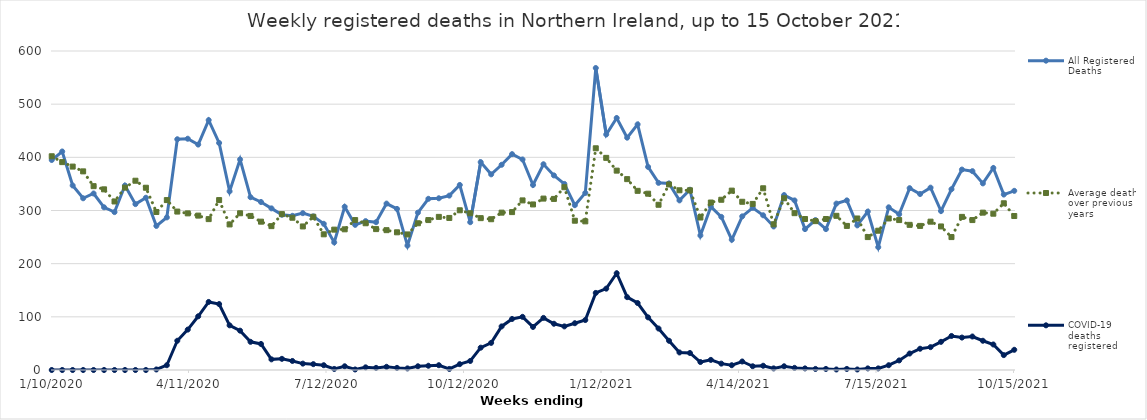
| Category | All Registered Deaths | Average deaths over previous 5 years | COVID-19 deaths registered |
|---|---|---|---|
| 1/10/20 | 395 | 402 | 0 |
| 1/17/20 | 411 | 391 | 0 |
| 1/24/20 | 347 | 382.6 | 0 |
| 1/31/20 | 323 | 373.6 | 0 |
| 2/7/20 | 332 | 345.8 | 0 |
| 2/14/20 | 306 | 339.8 | 0 |
| 2/21/20 | 297 | 317 | 0 |
| 2/28/20 | 347 | 343 | 0 |
| 3/6/20 | 312 | 356 | 0 |
| 3/13/20 | 324 | 342.8 | 0 |
| 3/20/20 | 271 | 297.2 | 1 |
| 3/27/20 | 287 | 319.6 | 9 |
| 4/3/20 | 434 | 298 | 55 |
| 4/10/20 | 435 | 294.6 | 76 |
| 4/17/20 | 424 | 290.4 | 101 |
| 4/24/20 | 470 | 283.8 | 128 |
| 5/1/20 | 427 | 319.6 | 124 |
| 5/8/20 | 336 | 273.8 | 84 |
| 5/15/20 | 396 | 294.8 | 74 |
| 5/22/20 | 325 | 289.8 | 53 |
| 5/29/20 | 316 | 279 | 49 |
| 6/5/20 | 304 | 270.6 | 20 |
| 6/12/20 | 292 | 293.2 | 21 |
| 6/19/20 | 290 | 286.4 | 17 |
| 6/26/20 | 295 | 270 | 12 |
| 7/3/20 | 289 | 288.2 | 11 |
| 7/10/20 | 275 | 255.2 | 9 |
| 7/17/20 | 240 | 264 | 2 |
| 7/24/20 | 307 | 264.6 | 7 |
| 7/31/20 | 273 | 282 | 1 |
| 8/7/20 | 280 | 276 | 5 |
| 8/14/20 | 278 | 265 | 4 |
| 8/21/20 | 313 | 263 | 6 |
| 8/28/20 | 303 | 259 | 4 |
| 9/4/20 | 234 | 255 | 3 |
| 9/11/20 | 296 | 276 | 7 |
| 9/18/20 | 322 | 282 | 8 |
| 9/25/20 | 323 | 288 | 9 |
| 10/2/20 | 328 | 286 | 2 |
| 10/9/20 | 348 | 300.4 | 11 |
| 10/16/20 | 278 | 294.8 | 17 |
| 10/23/20 | 391 | 285.6 | 42 |
| 10/30/20 | 368 | 283.6 | 51 |
| 11/6/20 | 386 | 296 | 82 |
| 11/13/20 | 406 | 297 | 96 |
| 11/20/20 | 396 | 319 | 100 |
| 11/27/20 | 348 | 311.4 | 81 |
| 12/4/20 | 387 | 322.4 | 98 |
| 12/11/20 | 366 | 321.8 | 87 |
| 12/18/20 | 350 | 343.8 | 82 |
| 12/25/20 | 310 | 280.8 | 88 |
| 1/1/21 | 333 | 279.6 | 94 |
| 1/8/21 | 568 | 417 | 145 |
| 1/15/21 | 443 | 399 | 153 |
| 1/22/21 | 474 | 375 | 182 |
| 1/29/21 | 437 | 359 | 137 |
| 2/5/21 | 462 | 337 | 126 |
| 2/12/21 | 382 | 331.6 | 99 |
| 2/19/21 | 352 | 310.8 | 78 |
| 2/26/21 | 351 | 349 | 55 |
| 3/5/21 | 319 | 338 | 33 |
| 3/12/21 | 339 | 338 | 32 |
| 3/19/21 | 253 | 286.8 | 15 |
| 3/26/21 | 307 | 315 | 19 |
| 4/2/21 | 288 | 320.2 | 12 |
| 4/9/21 | 245 | 337.4 | 9 |
| 4/16/21 | 289 | 316.4 | 16 |
| 4/23/21 | 305 | 312.4 | 7 |
| 4/30/21 | 291 | 341.8 | 8 |
| 5/7/21 | 270 | 274 | 3 |
| 5/14/21 | 329 | 323 | 7 |
| 5/21/21 | 319 | 295 | 4 |
| 5/28/21 | 265 | 284 | 3 |
| 6/4/21 | 282 | 280 | 2 |
| 6/11/21 | 265 | 284 | 2 |
| 6/18/21 | 313 | 290 | 1 |
| 6/25/21 | 319 | 271 | 2 |
| 7/2/21 | 272 | 285 | 1 |
| 7/9/21 | 298 | 250 | 3 |
| 7/16/21 | 231 | 262 | 3 |
| 7/23/21 | 306 | 285 | 9 |
| 7/30/21 | 293 | 282 | 18 |
| 8/6/21 | 342 | 273 | 31 |
| 8/13/21 | 331 | 271 | 40 |
| 8/20/21 | 343 | 279 | 43 |
| 8/27/21 | 299 | 270 | 53 |
| 9/3/21 | 340 | 250 | 64 |
| 9/10/21 | 377 | 288 | 61 |
| 9/17/21 | 374 | 282 | 63 |
| 9/24/21 | 351 | 296 | 55 |
| 10/1/21 | 380 | 294 | 48 |
| 10/8/21 | 330 | 313.6 | 28 |
| 10/15/21 | 337 | 289.6 | 38 |